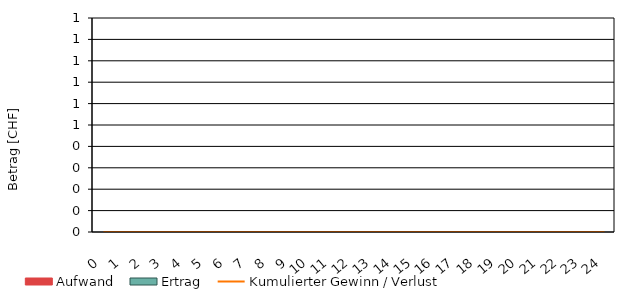
| Category | Aufwand | Ertrag |
|---|---|---|
| 0.0 | 0 | 0 |
| 1.0 | 0 | 0 |
| 2.0 | 0 | 0 |
| 3.0 | 0 | 0 |
| 4.0 | 0 | 0 |
| 5.0 | 0 | 0 |
| 6.0 | 0 | 0 |
| 7.0 | 0 | 0 |
| 8.0 | 0 | 0 |
| 9.0 | 0 | 0 |
| 10.0 | 0 | 0 |
| 11.0 | 0 | 0 |
| 12.0 | 0 | 0 |
| 13.0 | 0 | 0 |
| 14.0 | 0 | 0 |
| 15.0 | 0 | 0 |
| 16.0 | 0 | 0 |
| 17.0 | 0 | 0 |
| 18.0 | 0 | 0 |
| 19.0 | 0 | 0 |
| 20.0 | 0 | 0 |
| 21.0 | 0 | 0 |
| 22.0 | 0 | 0 |
| 23.0 | 0 | 0 |
| 24.0 | 0 | 0 |